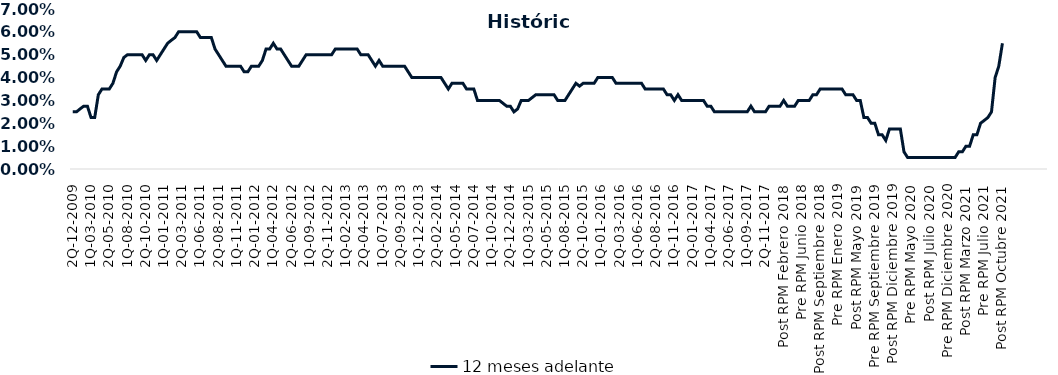
| Category | 12 meses adelante  |
|---|---|
| 2Q-12-2009 | 0.025 |
| 1Q-01-2010 | 0.025 |
| 2Q-01-2010 | 0.026 |
| 1Q-02-2010 | 0.028 |
| 2Q-02-2010 | 0.028 |
| 1Q-03-2010 | 0.022 |
| 2Q-03-2010 | 0.022 |
| 1Q-04-2010 | 0.032 |
| 2Q-04-2010 | 0.035 |
| 1Q-05-2010 | 0.035 |
| 2Q-05-2010 | 0.035 |
| 1Q-06-2010 | 0.038 |
| 2Q-06-2010 | 0.042 |
| 1Q-07-2010 | 0.045 |
| 2Q-07-2010 | 0.049 |
| 1Q-08-2010 | 0.05 |
| 2Q-08-2010 | 0.05 |
| 1Q-09-2010 | 0.05 |
| 2Q-09-2010 | 0.05 |
| 1Q-10-2010 | 0.05 |
| 2Q-10-2010 | 0.048 |
| 1Q-11-2010 | 0.05 |
| 2Q-11-2010 | 0.05 |
| 1Q-12-2010 | 0.048 |
| 2Q-12-2010 | 0.05 |
| 1Q-01-2011 | 0.052 |
| 2Q-01-2011 | 0.055 |
| 1Q-02-2011 | 0.056 |
| 2Q-02-2011 | 0.058 |
| 1Q-03-2011 | 0.06 |
| 2Q-03-2011 | 0.06 |
| 1Q-04-2011 | 0.06 |
| 2Q-04-2011 | 0.06 |
| 1Q-05-2011 | 0.06 |
| 2Q-05-2011 | 0.06 |
| 1Q-06-2011 | 0.058 |
| 2Q-06-2011 | 0.058 |
| 1Q-07-2011 | 0.058 |
| 2Q-07-2011 | 0.058 |
| 1Q-08-2011 | 0.052 |
| 2Q-08-2011 | 0.05 |
| 1Q-09-2011 | 0.048 |
| 2Q-09-2011 | 0.045 |
| 1Q-10-2011 | 0.045 |
| 2Q-10-2011 | 0.045 |
| 1Q-11-2011 | 0.045 |
| 2Q-11-2011 | 0.045 |
| 1Q-12-2011 | 0.042 |
| 2Q-12-2011 | 0.042 |
| 1Q-01-2012 | 0.045 |
| 2Q-01-2012 | 0.045 |
| 1Q-02-2012 | 0.045 |
| 2Q-02-2012 | 0.048 |
| 1Q-03-2012 | 0.052 |
| 2Q-03-2012 | 0.052 |
| 1Q-04-2012 | 0.055 |
| 2Q-04-2012 | 0.052 |
| 1Q-05-2012 | 0.052 |
| 2Q-05-2012 | 0.05 |
| 1Q-06-2012 | 0.048 |
| 2Q-06-2012 | 0.045 |
| 1Q-07-2012 | 0.045 |
| 2Q-07-2012 | 0.045 |
| 1Q-08-2012 | 0.048 |
| 2Q-08-2012 | 0.05 |
| 1Q-09-2012 | 0.05 |
| 2Q-09-2012 | 0.05 |
| 1Q-10-2012 | 0.05 |
| 2Q-10-2012 | 0.05 |
| 1Q-11-2012 | 0.05 |
| 2Q-11-2012 | 0.05 |
| 1Q-12-2012 | 0.05 |
| 2Q-12-2012 | 0.052 |
| 1Q-01-2013 | 0.052 |
| 2Q-01-2013 | 0.052 |
| 1Q-02-2013 | 0.052 |
| 2Q-02-2013 | 0.052 |
| 1Q-03-2013 | 0.052 |
| 2Q-03-2013 | 0.052 |
| 1Q-04-2013 | 0.05 |
| 2Q-04-2013 | 0.05 |
| 1Q-05-2013 | 0.05 |
| 2Q-05-2013 | 0.048 |
| 1Q-06-2013 | 0.045 |
| 2Q-06-2013 | 0.048 |
| 1Q-07-2013 | 0.045 |
| 2Q-07-2013 | 0.045 |
| 1Q-08-2013 | 0.045 |
| 2Q-08-2013 | 0.045 |
| 1Q-09-2013 | 0.045 |
| 2Q-09-2013 | 0.045 |
| 1Q-10-2013 | 0.045 |
| 2Q-10-2013 | 0.042 |
| 1Q-11-2013 | 0.04 |
| 2Q-11-2013 | 0.04 |
| 1Q-12-2013 | 0.04 |
| 2Q-12-2013 | 0.04 |
| 1Q-01-2014 | 0.04 |
| 2Q-01-2014 | 0.04 |
| 1Q-02-2014 | 0.04 |
| 2Q-02-2014 | 0.04 |
| 1Q-03-2014 | 0.04 |
| 2Q-03-2014 | 0.038 |
| 1Q-04-2014 | 0.035 |
| 2Q-04-2014 | 0.038 |
| 1Q-05-2014 | 0.038 |
| 2Q-05-2014 | 0.038 |
| 1Q-06-2014 | 0.038 |
| 2Q-06-2014 | 0.035 |
| 1Q-07-2014 | 0.035 |
| 2Q-07-2014 | 0.035 |
| 1Q-08-2014 | 0.03 |
| 2Q-08-2014 | 0.03 |
| 1Q-09-2014 | 0.03 |
| 2Q-09-2014 | 0.03 |
| 1Q-10-2014 | 0.03 |
| 2Q-10-2014 | 0.03 |
| 1Q-11-2014 | 0.03 |
| 2Q-11-2014 | 0.029 |
| 1Q-12-2014 | 0.028 |
| 2Q-12-2014 | 0.028 |
| 1Q-01-2015 | 0.025 |
| 2Q-01-2015 | 0.026 |
| 1Q-02-2015 | 0.03 |
| 2Q-02-2015 | 0.03 |
| 1Q-03-2015 | 0.03 |
| 2Q-03-2015 | 0.031 |
| 1Q-04-2015 | 0.032 |
| 2Q-04-2015 | 0.032 |
| 1Q-05-2015 | 0.032 |
| 2Q-05-2015 | 0.032 |
| 1Q-06-2015 | 0.032 |
| 2Q-06-2015 | 0.032 |
| 1Q-07-2015 | 0.03 |
| 2Q-07-2015 | 0.03 |
| 1Q-08-2015 | 0.03 |
| 2Q-08-2015 | 0.032 |
| 1Q-09-2015 | 0.035 |
| 2Q-09-2015 | 0.038 |
| 1Q-10-2015 | 0.036 |
| 2Q-10-2015 | 0.038 |
| 1Q-11-2015 | 0.038 |
| 2Q-11-2015 | 0.038 |
| 1Q-12-2015 | 0.038 |
| 2Q-12-2015 | 0.04 |
| 1Q-01-2016 | 0.04 |
| 2Q-01-2016 | 0.04 |
| 1Q-02-2016 | 0.04 |
| 2Q-02-2016 | 0.04 |
| 1Q-03-2016 | 0.038 |
| 2Q-03-2016 | 0.038 |
| 1Q-04-2016 | 0.038 |
| 2Q-04-2016 | 0.038 |
| 1Q-05-2016 | 0.038 |
| 2Q-05-2016 | 0.038 |
| 1Q-06-2016 | 0.038 |
| 2Q-06-2016 | 0.038 |
| 1Q-07-2016 | 0.035 |
| 2Q-07-2016 | 0.035 |
| 1Q-08-2016 | 0.035 |
| 2Q-08-2016 | 0.035 |
| 1Q-09-2016 | 0.035 |
| 2Q-09-2016 | 0.035 |
| 1Q-10-2016 | 0.032 |
| 2Q-10-2016 | 0.032 |
| 1Q-11-2016 | 0.03 |
| 2Q-11-2016 | 0.032 |
| 1Q-12-2016 | 0.03 |
| 2Q-12-2016 | 0.03 |
| 1Q-01-2017 | 0.03 |
| 2Q-01-2017 | 0.03 |
| 1Q-02-2017 | 0.03 |
| 2Q-02-2017 | 0.03 |
| 1Q-03-2017 | 0.03 |
| 2Q-03-2017 | 0.028 |
| 1Q-04-2017 | 0.028 |
| 2Q-04-2017 | 0.025 |
| 1Q-05-2017 | 0.025 |
| 2Q-05-2017 | 0.025 |
| 1Q-06-2017 | 0.025 |
| 2Q-06-2017 | 0.025 |
| 1Q-07-2017 | 0.025 |
| 2Q-07-2017 | 0.025 |
| 1Q-08-2017 | 0.025 |
| 2Q-08-2017 | 0.025 |
| 1Q-09-2017 | 0.025 |
| 2Q-09-2017 | 0.028 |
| 1Q-10-2017 | 0.025 |
| 2Q-10-2017 | 0.025 |
| 1Q-11-2017 | 0.025 |
| 2Q-11-2017 | 0.025 |
| 1Q-12-2017 | 0.028 |
| 2Q-12-2017 | 0.028 |
| 1Q-01-2018 | 0.028 |
| 2Q-01-2018 | 0.028 |
| Post RPM Febrero 2018 | 0.03 |
| Pre RPM Marzo 2018 | 0.028 |
| Post RPM Marzo 2018 | 0.028 |
| Pre RPM Mayo 2018 | 0.028 |
| Post RPM Mayo 2018 | 0.03 |
| Pre RPM Junio 2018 | 0.03 |
| Post RPM Junio 2018 | 0.03 |
| Pre RPM Julio 2018 | 0.03 |
| Post RPM Julio 2018 | 0.032 |
| Pre RPM Septiembre 2018 | 0.032 |
| Post RPM Septiembre 2018 | 0.035 |
| Pre RPM Octubre 2018 | 0.035 |
| Post RPM Octubre 2018 | 0.035 |
| Pre RPM Diciembre 2018 | 0.035 |
| Post RPM Diciembre 2018 | 0.035 |
| Pre RPM Enero 2019 | 0.035 |
| Post RPM Enero 2019 | 0.035 |
| Pre RPM Marzo 2019 | 0.032 |
| Post RPM Marzo 2019 | 0.032 |
| Pre RPM Mayo 2019 | 0.032 |
| Post RPM Mayo 2019 | 0.03 |
| Pre RPM Junio 2019 | 0.03 |
| Post RPM Junio 2019 | 0.022 |
| Pre RPM Julio 2019 | 0.022 |
| Post RPM Julio 2019 | 0.02 |
| Pre RPM Septiembre 2019 | 0.02 |
| Post RPM Septiembre 2019 | 0.015 |
| Pre RPM Octubre 2019 | 0.015 |
| Post RPM Octubre 2019 | 0.012 |
| Pre RPM Diciembre 2019 | 0.018 |
| Post RPM Diciembre 2019 | 0.018 |
| Pre RPM Enero 2020 | 0.018 |
| Post RPM Enero 2020 | 0.018 |
| Pre RPM Marzo 2020 | 0.008 |
| Post RPM Marzo 2020 | 0.005 |
| Pre RPM Mayo 2020 | 0.005 |
| Post RPM Mayo 2020 | 0.005 |
| Pre RPM Junio 2020 | 0.005 |
| Post RPM Junio 2020 | 0.005 |
| Pre RPM Julio 2020 | 0.005 |
| Post RPM Julio 2020 | 0.005 |
| Pre RPM Septiembre 2020 | 0.005 |
| Post RPM Septiembre 2020 | 0.005 |
| Pre RPM Octubre 2020 | 0.005 |
| Post RPM Octubre 2020 | 0.005 |
| Pre RPM Diciembre 2020 | 0.005 |
| Post RPM Diciembre 2020 | 0.005 |
| Pre RPM Enero 2021 | 0.005 |
| Post RPM Enero 2021 | 0.008 |
| Pre RPM Marzo 2021 | 0.008 |
| Post RPM Marzo 2021 | 0.01 |
| Pre RPM Mayo 2021 | 0.01 |
| Post RPM Mayo 2021 | 0.015 |
| Pre RPM Junio 2021 | 0.015 |
| Post RPM Junio 2021 | 0.02 |
| Pre RPM Julio 2021 | 0.021 |
| Post RPM Julio 2021 | 0.022 |
| Pre RPM Agosto 2021 | 0.025 |
| Post RPM Agosto 2021 | 0.04 |
| Pre RPM Octubre 2021 | 0.045 |
| Post RPM Octubre 2021 | 0.055 |